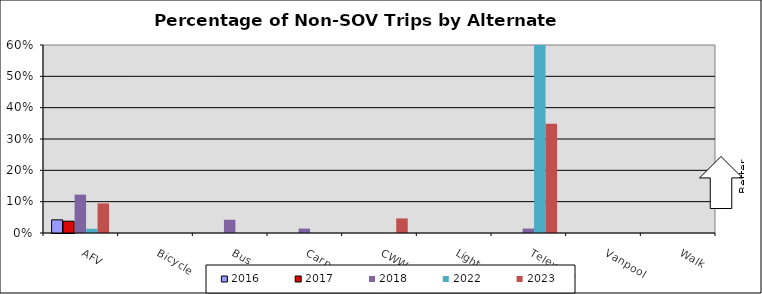
| Category | 2016 | 2017 | 2018 | 2022 | 2023 |
|---|---|---|---|---|---|
| AFV | 0.042 | 0.038 | 0.123 | 0.013 | 0.094 |
| Bicycle | 0 | 0 | 0 | 0 | 0 |
| Bus | 0 | 0 | 0.042 | 0 | 0 |
| Carpool | 0 | 0 | 0.014 | 0 | 0 |
| CWW | 0 | 0 | 0 | 0 | 0.047 |
| Light Rail | 0 | 0 | 0 | 0 | 0 |
| Telework | 0 | 0 | 0.014 | 0.698 | 0.349 |
| Vanpool | 0 | 0 | 0 | 0 | 0 |
| Walk | 0 | 0 | 0 | 0 | 0 |